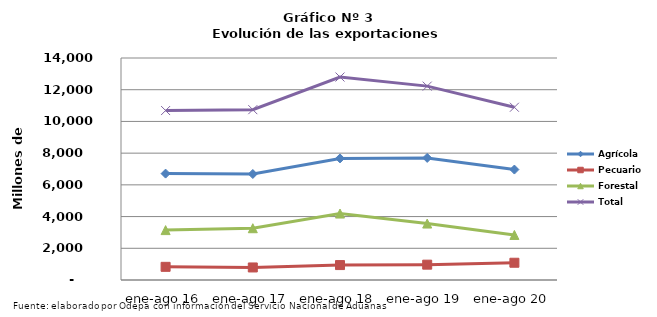
| Category | Agrícola | Pecuario | Forestal | Total |
|---|---|---|---|---|
| ene-ago 16 | 6709450 | 830515 | 3146894 | 10686859 |
| ene-ago 17 | 6685634 | 790972 | 3265313 | 10741919 |
| ene-ago 18 | 7667857 | 941525 | 4190498 | 12799880 |
| ene-ago 19 | 7699002 | 967387 | 3559466 | 12225855 |
| ene-ago 20 | 6965344 | 1087999 | 2841244 | 10894587 |